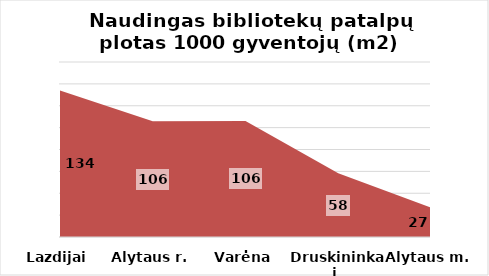
| Category | Series 0 |
|---|---|
| Lazdijai | 133.907 |
| Alytaus r. | 105.876 |
| Varėna | 106.086 |
| Druskininkai  | 58.279 |
| Alytaus m. | 26.792 |